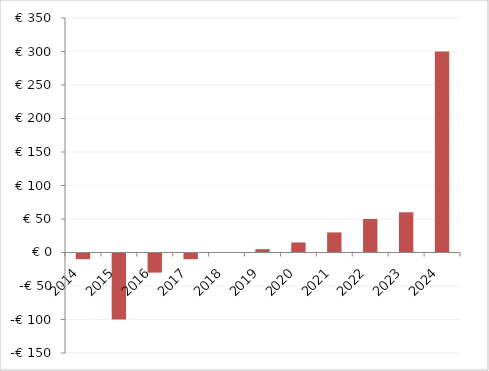
| Category | Series 1 |
|---|---|
| 2014.0 | -10 |
| 2015.0 | -100 |
| 2016.0 | -30 |
| 2017.0 | -10 |
| 2018.0 | 0 |
| 2019.0 | 5 |
| 2020.0 | 15 |
| 2021.0 | 30 |
| 2022.0 | 50 |
| 2023.0 | 60 |
| 2024.0 | 300 |